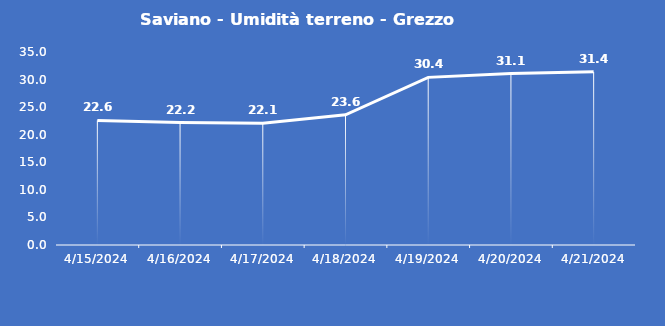
| Category | Saviano - Umidità terreno - Grezzo (%VWC) |
|---|---|
| 4/15/24 | 22.6 |
| 4/16/24 | 22.2 |
| 4/17/24 | 22.1 |
| 4/18/24 | 23.6 |
| 4/19/24 | 30.4 |
| 4/20/24 | 31.1 |
| 4/21/24 | 31.4 |